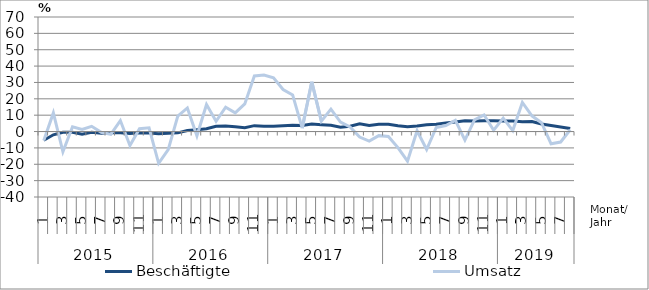
| Category | Beschäftigte | Umsatz |
|---|---|---|
| 0 | -5.3 | -5.5 |
| 1 | -2 | 11.4 |
| 2 | -0.5 | -12.4 |
| 3 | -0.5 | 2.9 |
| 4 | -1.7 | 1.3 |
| 5 | -0.5 | 3.2 |
| 6 | -1.1 | -0.5 |
| 7 | -0.8 | -1.7 |
| 8 | -0.7 | 6.7 |
| 9 | -1.2 | -8.5 |
| 10 | -0.7 | 1.7 |
| 11 | -0.9 | 2.3 |
| 12 | -1.3 | -19.4 |
| 13 | -1.1 | -11 |
| 14 | -0.8 | 9.4 |
| 15 | 0.6 | 14.4 |
| 16 | 1.1 | -2.6 |
| 17 | 1.7 | 16.5 |
| 18 | 3.2 | 6.3 |
| 19 | 3.4 | 14.9 |
| 20 | 3 | 11.4 |
| 21 | 2.4 | 16.9 |
| 22 | 3.6 | 34 |
| 23 | 3.2 | 34.5 |
| 24 | 3.3 | 32.8 |
| 25 | 3.6 | 25.7 |
| 26 | 3.9 | 22.4 |
| 27 | 3.7 | 2.1 |
| 28 | 4.6 | 30.4 |
| 29 | 4.2 | 6.4 |
| 30 | 3.8 | 13.7 |
| 31 | 2.7 | 5.8 |
| 32 | 3.3 | 2.8 |
| 33 | 4.7 | -3.4 |
| 34 | 3.7 | -5.8 |
| 35 | 4.4 | -2.5 |
| 36 | 4.5 | -3 |
| 37 | 3.6 | -9.8 |
| 38 | 2.9 | -18.1 |
| 39 | 3.4 | 0.5 |
| 40 | 4.2 | -11 |
| 41 | 4.5 | 2.5 |
| 42 | 5.3 | 3.7 |
| 43 | 5.8 | 6.8 |
| 44 | 6.6 | -5.2 |
| 45 | 6.5 | 7.1 |
| 46 | 6.6 | 10.1 |
| 47 | 6.6 | 0.8 |
| 48 | 6.4 | 8.2 |
| 49 | 6.5 | 0.6 |
| 50 | 6 | 17.8 |
| 51 | 6.1 | 9.6 |
| 52 | 4.6 | 5.4 |
| 53 | 3.7 | -7.5 |
| 54 | 2.8 | -6.4 |
| 55 | 1.9 | 1.1 |